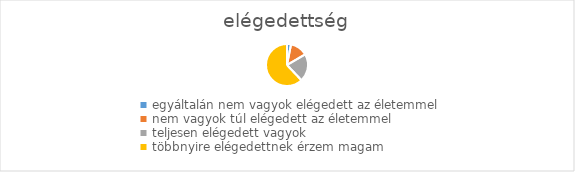
| Category | Series 0 |
|---|---|
| egyáltalán nem vagyok elégedett az életemmel | 14 |
| nem vagyok túl elégedett az életemmel | 62 |
| teljesen elégedett vagyok | 98 |
| többnyire elégedettnek érzem magam | 285 |